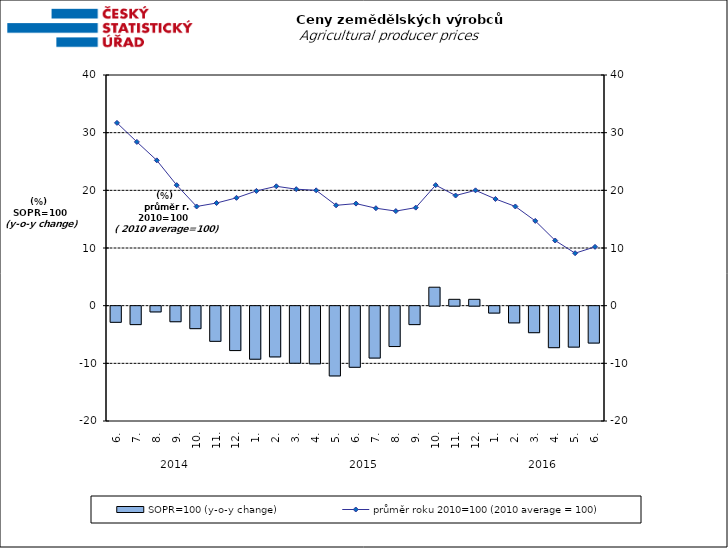
| Category | SOPR=100 (y-o-y change)   |
|---|---|
| 0 | -2.8 |
| 1 | -3.2 |
| 2 | -1 |
| 3 | -2.7 |
| 4 | -3.9 |
| 5 | -6.1 |
| 6 | -7.7 |
| 7 | -9.2 |
| 8 | -8.8 |
| 9 | -9.9 |
| 10 | -10 |
| 11 | -12.1 |
| 12 | -10.6 |
| 13 | -9 |
| 14 | -7 |
| 15 | -3.2 |
| 16 | 3.2 |
| 17 | 1.1 |
| 18 | 1.1 |
| 19 | -1.2 |
| 20 | -2.9 |
| 21 | -4.6 |
| 22 | -7.2 |
| 23 | -7.1 |
| 24 | -6.4 |